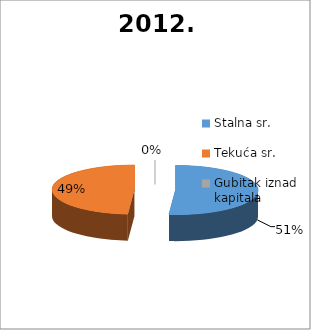
| Category | 2012. |
|---|---|
| Stalna sr. | 1341924 |
| Tekuća sr. | 1275532 |
| Gubitak iznad kapitala | 0 |